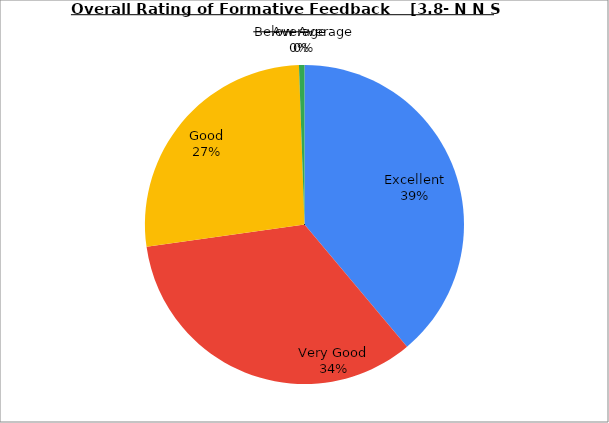
| Category | Series 0 |
|---|---|
| Excellent | 38.889 |
| Very Good | 33.889 |
| Good | 26.667 |
| Average | 0.556 |
| Below Average | 0 |